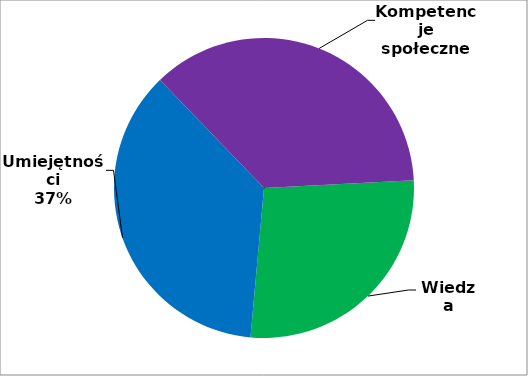
| Category | Series 0 |
|---|---|
| 0 | 12 |
| 1 | 16 |
| 2 | 16 |